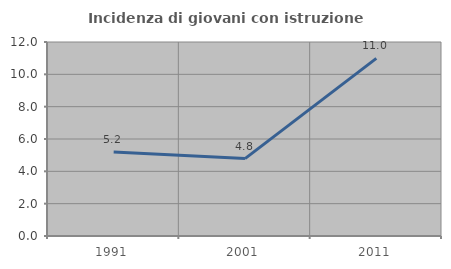
| Category | Incidenza di giovani con istruzione universitaria |
|---|---|
| 1991.0 | 5.189 |
| 2001.0 | 4.789 |
| 2011.0 | 10.991 |